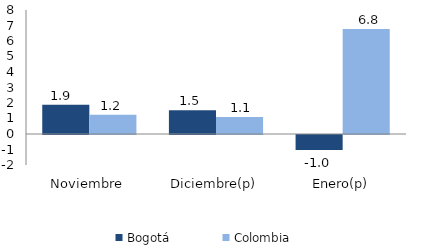
| Category | Bogotá | Colombia |
|---|---|---|
| Noviembre | 1.882 | 1.241 |
| Diciembre(p) | 1.536 | 1.102 |
| Enero(p) | -0.966 | 6.776 |